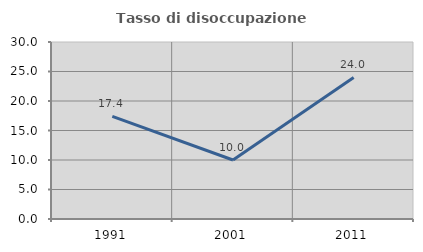
| Category | Tasso di disoccupazione giovanile  |
|---|---|
| 1991.0 | 17.391 |
| 2001.0 | 10 |
| 2011.0 | 24 |